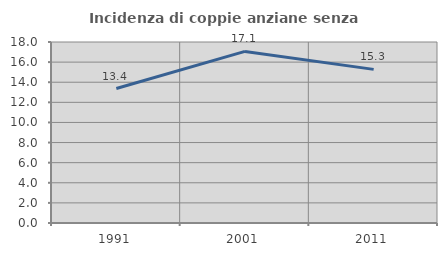
| Category | Incidenza di coppie anziane senza figli  |
|---|---|
| 1991.0 | 13.373 |
| 2001.0 | 17.063 |
| 2011.0 | 15.278 |